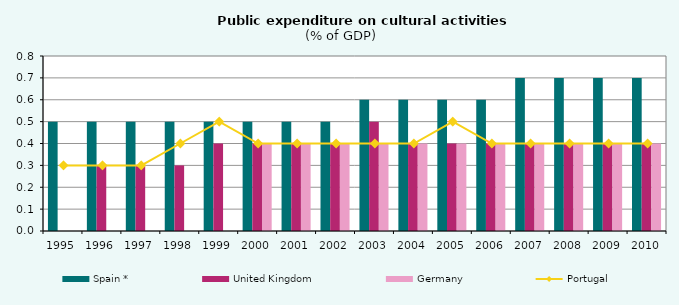
| Category | Spain * | United Kingdom | Germany |
|---|---|---|---|
| 1995.0 | 0.5 | 0 | 0 |
| 1996.0 | 0.5 | 0.3 | 0 |
| 1997.0 | 0.5 | 0.3 | 0 |
| 1998.0 | 0.5 | 0.3 | 0 |
| 1999.0 | 0.5 | 0.4 | 0 |
| 2000.0 | 0.5 | 0.4 | 0.4 |
| 2001.0 | 0.5 | 0.4 | 0.4 |
| 2002.0 | 0.5 | 0.4 | 0.4 |
| 2003.0 | 0.6 | 0.5 | 0.4 |
| 2004.0 | 0.6 | 0.4 | 0.4 |
| 2005.0 | 0.6 | 0.4 | 0.4 |
| 2006.0 | 0.6 | 0.4 | 0.4 |
| 2007.0 | 0.7 | 0.4 | 0.4 |
| 2008.0 | 0.7 | 0.4 | 0.4 |
| 2009.0 | 0.7 | 0.4 | 0.4 |
| 2010.0 | 0.7 | 0.4 | 0.4 |